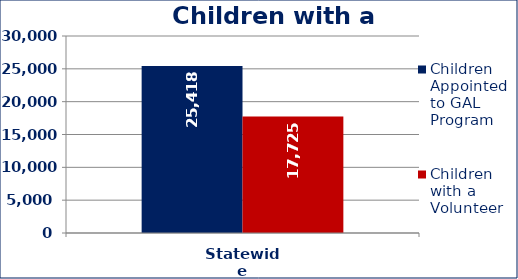
| Category | Children Appointed to GAL Program  | Children with a Volunteer  |
|---|---|---|
| Statewide | 25418 | 17725 |